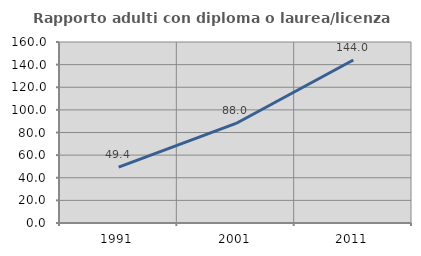
| Category | Rapporto adulti con diploma o laurea/licenza media  |
|---|---|
| 1991.0 | 49.398 |
| 2001.0 | 88 |
| 2011.0 | 144.048 |